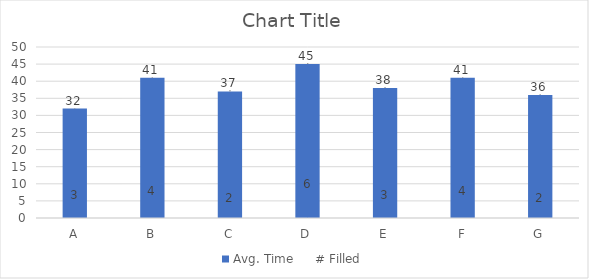
| Category | Avg. Time |
|---|---|
| A | 32 |
| B | 41 |
| C | 37 |
| D | 45 |
| E | 38 |
| F | 41 |
| G | 36 |